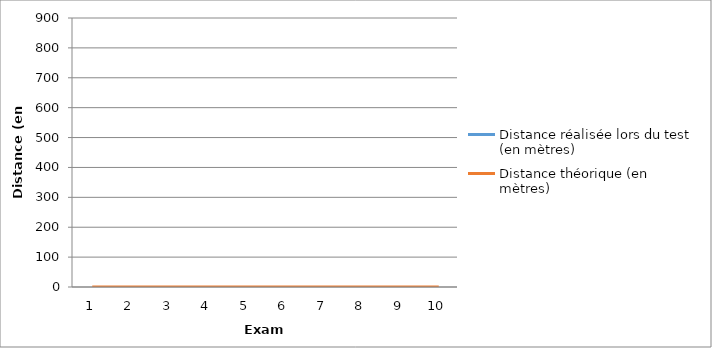
| Category | Distance réalisée lors du test (en mètres) | Distance théorique (en mètres) |
|---|---|---|
| 0 |  | 0 |
| 1 |  | 0 |
| 2 |  | 0 |
| 3 |  | 0 |
| 4 |  | 0 |
| 5 |  | 0 |
| 6 |  | 0 |
| 7 |  | 0 |
| 8 |  | 0 |
| 9 |  | 0 |